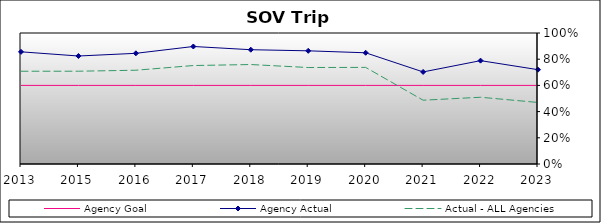
| Category | Agency Goal | Agency Actual | Actual - ALL Agencies |
|---|---|---|---|
| 2013.0 | 0.6 | 0.856 | 0.708 |
| 2015.0 | 0.6 | 0.824 | 0.708 |
| 2016.0 | 0.6 | 0.845 | 0.716 |
| 2017.0 | 0.6 | 0.897 | 0.752 |
| 2018.0 | 0.6 | 0.872 | 0.759 |
| 2019.0 | 0.6 | 0.864 | 0.736 |
| 2020.0 | 0.6 | 0.849 | 0.737 |
| 2021.0 | 0.6 | 0.703 | 0.487 |
| 2022.0 | 0.6 | 0.789 | 0.509 |
| 2023.0 | 0.6 | 0.72 | 0.47 |